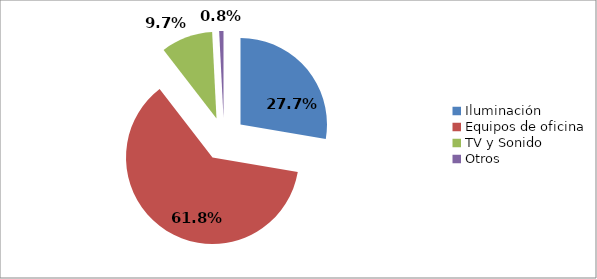
| Category | Series 0 |
|---|---|
| Iluminación  | 0.277 |
| Equipos de oficina | 0.618 |
| TV y Sonido | 0.097 |
| Otros | 0.008 |